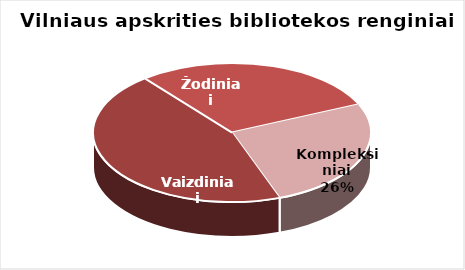
| Category | Series 0 |
|---|---|
| Vaizdiniai | 4018 |
| Žodiniai | 2616 |
| Kompleksiniai | 2343 |